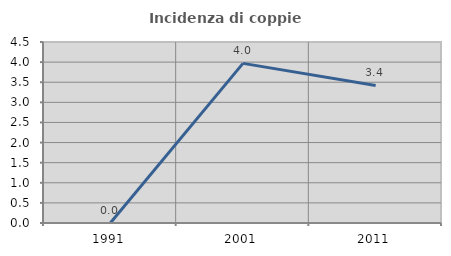
| Category | Incidenza di coppie miste |
|---|---|
| 1991.0 | 0 |
| 2001.0 | 3.968 |
| 2011.0 | 3.419 |